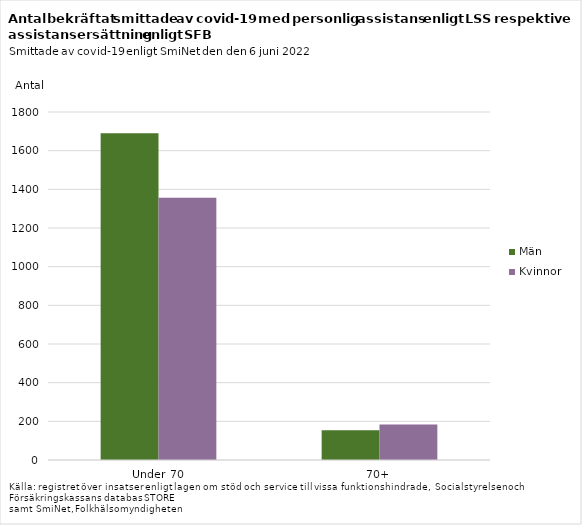
| Category | Män | Kvinnor |
|---|---|---|
| Under 70 | 1690 | 1356 |
| 70+ | 154 | 183 |